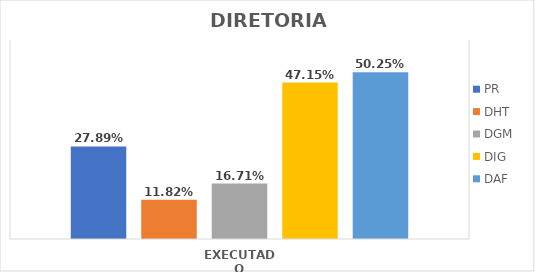
| Category | PR | DHT | DGM | DIG | DAF |
|---|---|---|---|---|---|
| EXECUTADO | 0.279 | 0.118 | 0.167 | 0.472 | 0.503 |